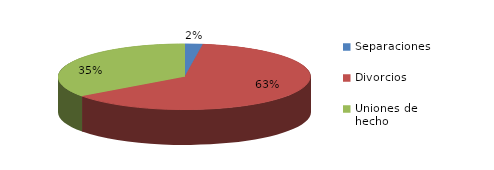
| Category | Series 0 |
|---|---|
| Separaciones | 5 |
| Divorcios | 136 |
| Uniones de hecho | 76 |